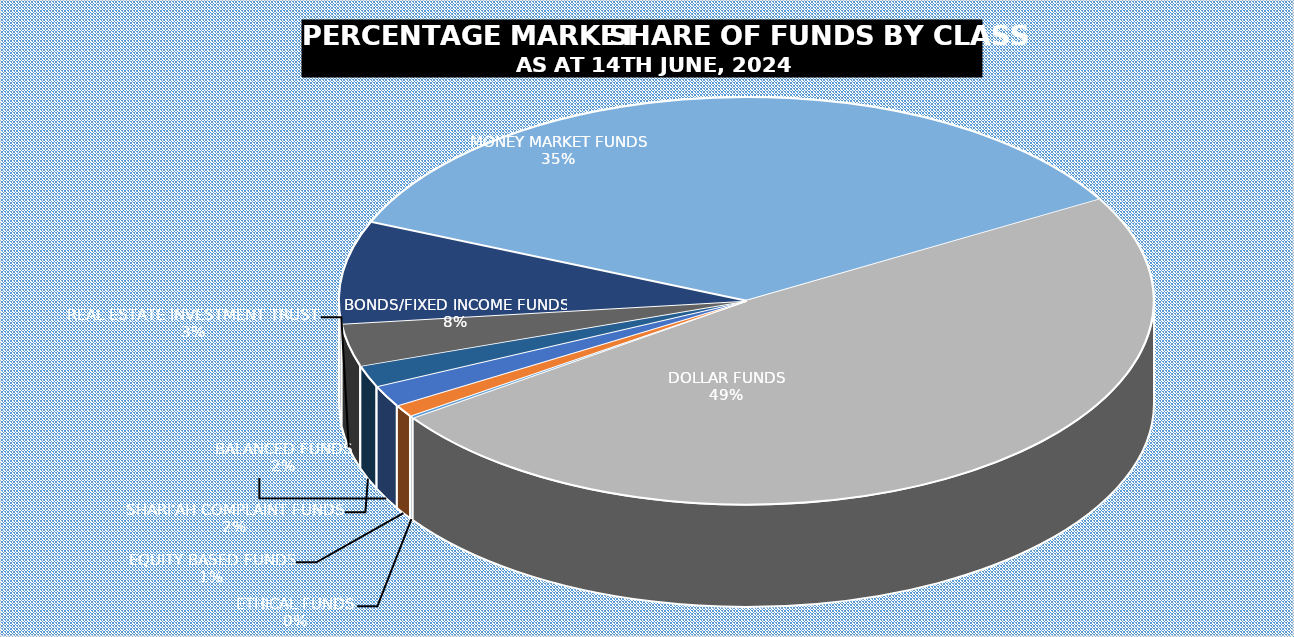
| Category | 14-Jun |
|---|---|
| ETHICAL FUNDS | 5139182455.18 |
| EQUITY BASED FUNDS | 28067702772.25 |
| BALANCED FUNDS | 49621576838.562 |
| SHARI'AH COMPLAINT FUNDS | 50385986316.249 |
| REAL ESTATE INVESTMENT TRUST | 98697054246.115 |
| BONDS/FIXED INCOME FUNDS | 238318816891.854 |
| MONEY MARKET FUNDS | 1035718749074.42 |
| DOLLAR FUNDS | 1422260670513.268 |